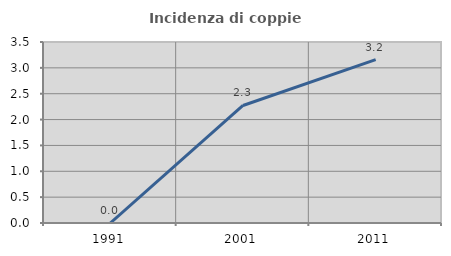
| Category | Incidenza di coppie miste |
|---|---|
| 1991.0 | 0 |
| 2001.0 | 2.273 |
| 2011.0 | 3.158 |